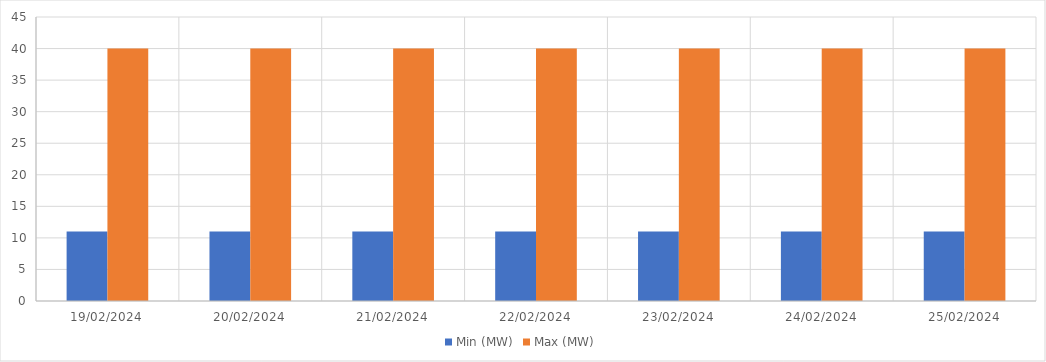
| Category | Min (MW) | Max (MW) |
|---|---|---|
| 19/02/2024 | 11 | 40 |
| 20/02/2024 | 11 | 40 |
| 21/02/2024 | 11 | 40 |
| 22/02/2024 | 11 | 40 |
| 23/02/2024 | 11 | 40 |
| 24/02/2024 | 11 | 40 |
| 25/02/2024 | 11 | 40 |